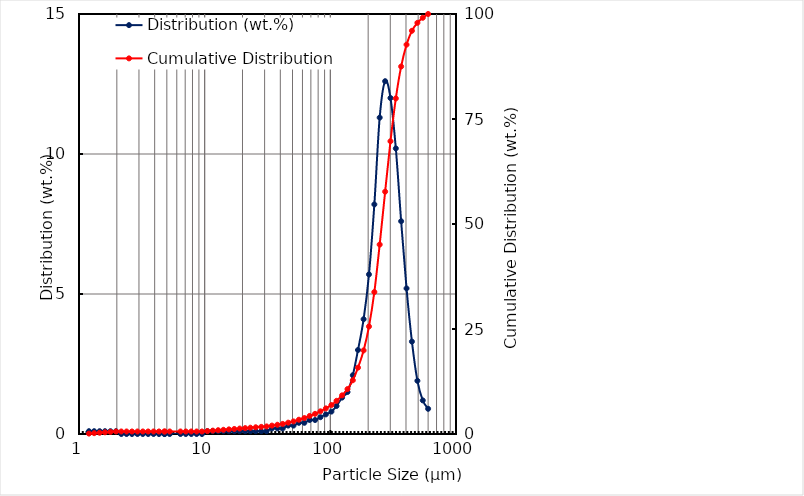
| Category | Distribution (wt.%) |
|---|---|
| 600.0 | 0.9 |
| 544.0 | 1.2 |
| 493.0 | 1.9 |
| 446.0 | 3.3 |
| 404.0 | 5.2 |
| 366.0 | 7.6 |
| 332.0 | 10.2 |
| 301.0 | 12 |
| 273.0 | 12.6 |
| 247.0 | 11.3 |
| 224.0 | 8.2 |
| 203.0 | 5.7 |
| 184.0 | 4.1 |
| 166.0 | 3 |
| 151.0 | 2.1 |
| 137.0 | 1.5 |
| 124.0 | 1.3 |
| 112.0 | 1 |
| 102.0 | 0.8 |
| 92.1 | 0.7 |
| 83.4 | 0.6 |
| 75.6 | 0.5 |
| 68.5 | 0.5 |
| 62.1 | 0.4 |
| 56.2 | 0.4 |
| 50.9 | 0.3 |
| 46.2 | 0.3 |
| 41.8 | 0.2 |
| 37.9 | 0.2 |
| 34.3 | 0.2 |
| 31.1 | 0.1 |
| 28.2 | 0.1 |
| 25.5 | 0.1 |
| 23.1 | 0.1 |
| 21.0 | 0.1 |
| 19.0 | 0.1 |
| 17.2 | 0.1 |
| 15.6 | 0.1 |
| 14.1 | 0.1 |
| 12.8 | 0.1 |
| 11.6 | 0.1 |
| 10.5 | 0.1 |
| 9.52 | 0 |
| 8.63 | 0 |
| 7.82 | 0 |
| 7.08 | 0 |
| 6.42 | 0 |
| 4.82 | 0 |
| 5.27 | 0 |
| 4.77 | 0 |
| 4.33 | 0 |
| 3.92 | 0 |
| 3.55 | 0 |
| 3.22 | 0 |
| 2.92 | 0 |
| 2.64 | 0 |
| 2.39 | 0 |
| 2.17 | 0 |
| 1.97 | 0.1 |
| 1.78 | 0.1 |
| 1.61 | 0.1 |
| 1.46 | 0.1 |
| 1.32 | 0.1 |
| 1.2 | 0.1 |